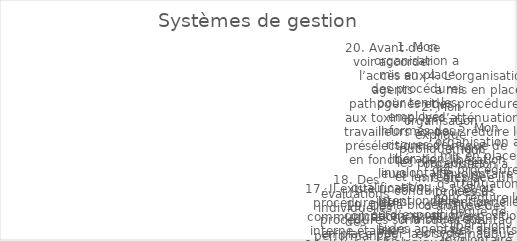
| Category | Series 0 |
|---|---|
| 1. Mon organisation a mis en place des procédures pour tenir les employés informés des risques de libération involontaire et/ou intentionnelle ou d’exposition à des agents biologiques et/ou à des toxines qui sont stockés ou manipulés dans nos installation | 3 |
| 2. Mon organisation explique publiquement les procédures et les règles de conduite liées à la biosécurité et à la biosûreté lors de l’orientation des nouveaux employés. | 1 |
| 3. Mon organisation a mis en place un processus d’analyse des risques-avantages systématique pour la recherche à double usage. | 1 |
| 4. L’organisation a mis en place des procédures d’atténuation pour réduire le risque de libération involontaire et/ou intentionnelle ou d’exposition à des agents biologiques et/ou des toxines stockés ou manipulés dans mon installation. | 5 |
| 5. Mon organisation a mis en place des procédures d’atténuation pour réduire le risque de libération involontaire et/ou intentionnelle ou d’exposition à des agents biologiques et/ou à des toxines stockés ou manipulés dans nos installations. | 5 |
| 6. Mon organisation a mis en place des procédures qui détaillent les actions requises lors d’un incident. | 2 |
| 7. Les leçons tirées des exercices d’urgence ont amélioré les performances organisationnelles. | 5 |
| 8. Mon organisation organise régulièrement des exercices d’intervention d’urgence. | 5 |
| 9. Il existe une liste à jour du personnel ayant un accès autorisé aux agents biologiques. | 3 |
| 10. L’utilisation des enseignements tirés des exercices d’urgence a amélioré les performances organisationnelles. | 0 |
| 11. Il existe une procédure permettant aux employés de signaler un comportement inhabituel à l’égard d’un collègue. | 1 |
| 12. L’utilisation des enseignements tirés des violations de la biosécurité/biosûreté ou des quasi-accidents a amélioré les performances organisationnelles. | 4 |
| 13. Il existe une liste disponible et à jour du personnel autorisé à accéder aux agents biologiques. | 2 |
| 14.  L’organisation a une formation continue en matière de biosécurité et de biosûreté et une formation axée sur les compétences pour les employés. | 5 |
| 15. Les informations concernant les mesures, procédures et politiques de biosécurité et de biosûreté sont facilement accessibles aux employés. | 4 |
| 16. Il existe une procédure permettant aux employés de signaler le comportement inhabituel d’un collègue. | 0 |
| 17. Il existe une procédure de communication interne établie pour informer les employés des incidents de biosécurité et de biosûreté et des quasi-accidents. | 5 |
| 18. Des évaluations individuelles des performances en matière de biosécurité/biosûreté ont lieu régulièrement. | 2 |
| 19. Des procédures sont en place pour la décontamination et la gestion des déchets. | 1 |
| 20. Avant de se voir accorder l’accès aux agents pathogènes et aux toxines, les travailleurs sont présélectionnés en fonction de leurs qualifications, leurs compétences et leurs caractéristiques personnelles appropriées pour le poste, et ainsi ils sont dé | 0 |